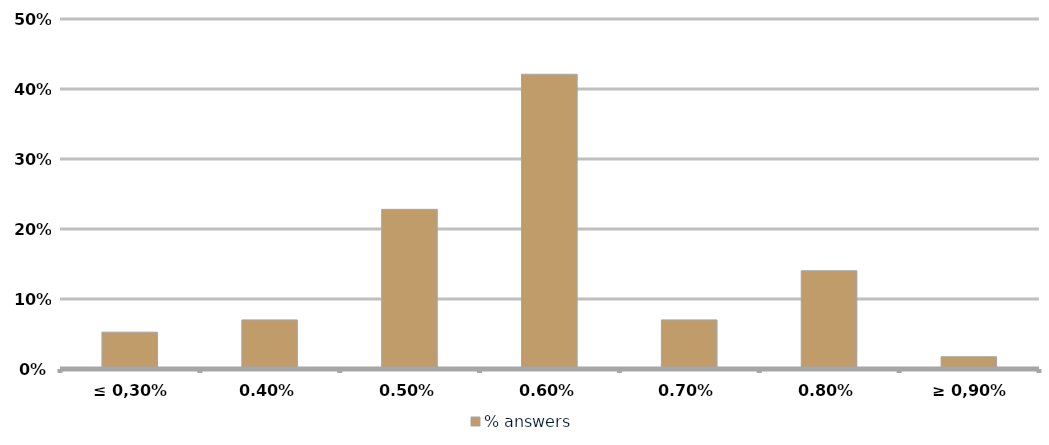
| Category | % answers |
|---|---|
| ≤ 0,30% | 0.053 |
| 0,40% | 0.07 |
| 0,50% | 0.228 |
| 0,60% | 0.421 |
| 0,70% | 0.07 |
| 0,80% | 0.14 |
| ≥ 0,90% | 0.018 |